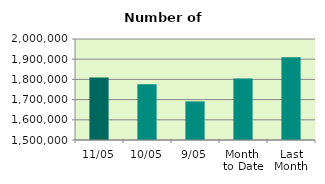
| Category | Series 0 |
|---|---|
| 11/05 | 1809220 |
| 10/05 | 1776124 |
| 9/05 | 1691236 |
| Month 
to Date | 1804580.25 |
| Last
Month | 1909115.889 |